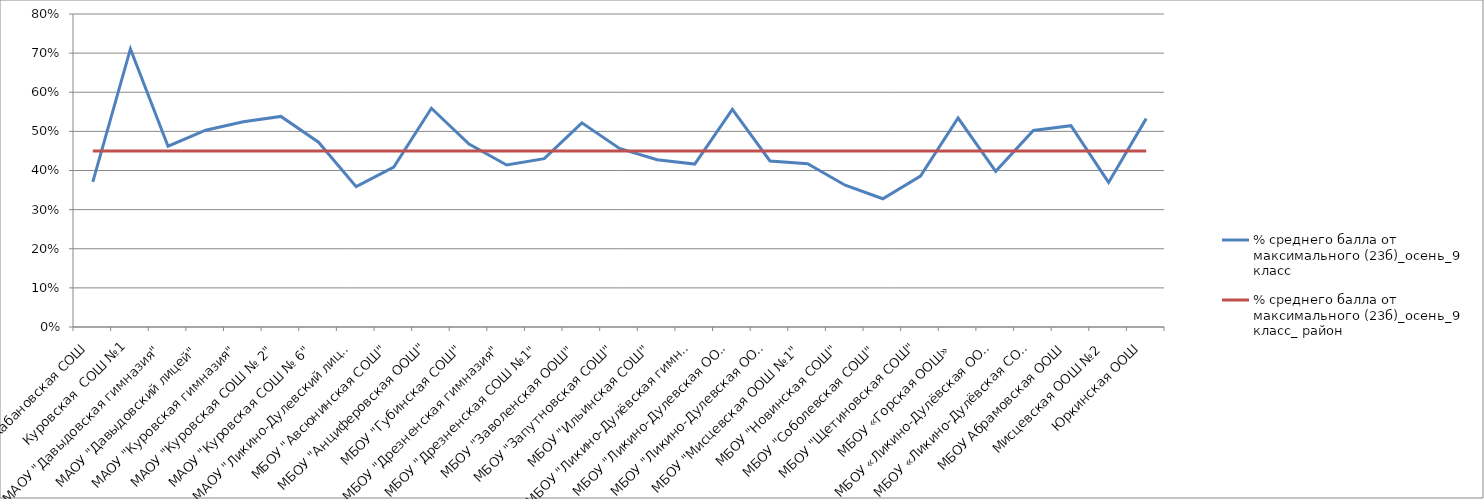
| Category | % среднего балла от максимального (23б)_осень_9 класс | % среднего балла от максимального (23б)_осень_9 класс_ район |
|---|---|---|
| Кабановская СОШ | 0.371 | 0.45 |
| Куровская  СОШ №1 | 0.711 | 0.45 |
| МАОУ "Давыдовская гимназия" | 0.462 | 0.45 |
| МАОУ "Давыдовский лицей" | 0.503 | 0.45 |
| МАОУ "Куровская гимназия" | 0.524 | 0.45 |
| МАОУ "Куровская СОШ № 2" | 0.538 | 0.45 |
| МАОУ "Куровская СОШ № 6" | 0.472 | 0.45 |
| МАОУ "Ликино-Дулевский лицей" | 0.359 | 0.45 |
| МБОУ "Авсюнинская СОШ" | 0.409 | 0.45 |
| МБОУ "Анциферовская ООШ" | 0.559 | 0.45 |
| МБОУ "Губинская СОШ" | 0.467 | 0.45 |
| МБОУ "Дрезненская гимназия" | 0.414 | 0.45 |
| МБОУ "Дрезненская СОШ №1" | 0.43 | 0.45 |
| МБОУ "Заволенская ООШ" | 0.522 | 0.45 |
| МБОУ "Запутновская СОШ" | 0.457 | 0.45 |
| МБОУ "Ильинская СОШ" | 0.428 | 0.45 |
| МБОУ "Ликино-Дулёвская гимназия" | 0.416 | 0.45 |
| МБОУ "Ликино-Дулевская ООШ №2" | 0.556 | 0.45 |
| МБОУ "Ликино-Дулевская ООШ №3" | 0.424 | 0.45 |
| МБОУ "Мисцевская ООШ №1" | 0.417 | 0.45 |
| МБОУ "Новинская СОШ" | 0.362 | 0.45 |
| МБОУ "Соболевская СОШ" | 0.328 | 0.45 |
| МБОУ "Щетиновская СОШ" | 0.386 | 0.45 |
| МБОУ «Горская ООШ» | 0.534 | 0.45 |
| МБОУ «Ликино-Дулёвская ООШ № 4» | 0.398 | 0.45 |
| МБОУ «Ликино-Дулёвская СОШ № 5» | 0.502 | 0.45 |
| МБОУ Абрамовская ООШ | 0.514 | 0.45 |
| Мисцевская ООШ №2 | 0.37 | 0.45 |
| Юркинская ООШ | 0.533 | 0.45 |